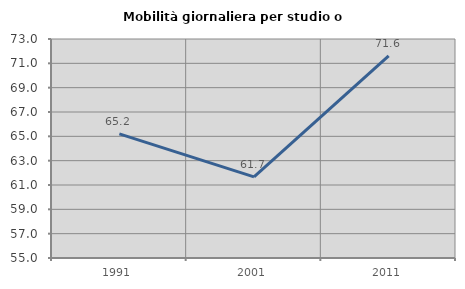
| Category | Mobilità giornaliera per studio o lavoro |
|---|---|
| 1991.0 | 65.198 |
| 2001.0 | 61.671 |
| 2011.0 | 71.612 |